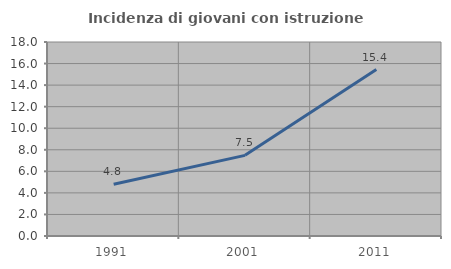
| Category | Incidenza di giovani con istruzione universitaria |
|---|---|
| 1991.0 | 4.795 |
| 2001.0 | 7.483 |
| 2011.0 | 15.441 |